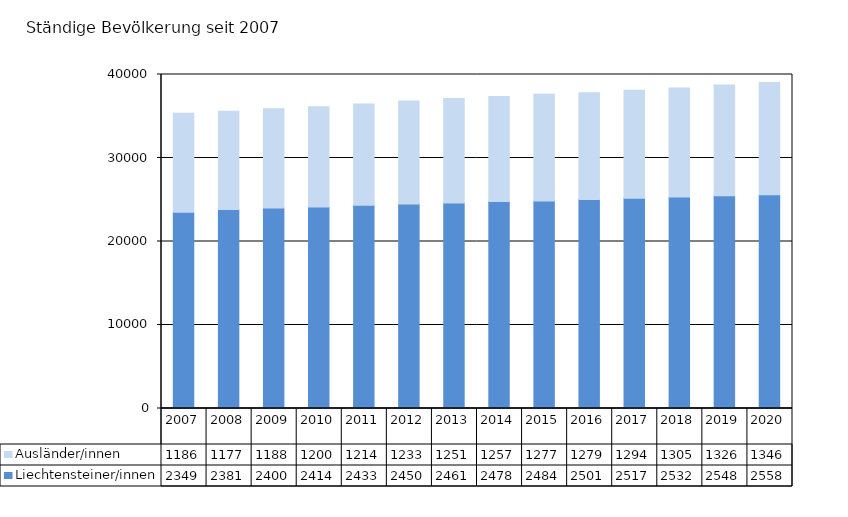
| Category | Liechtensteiner/innen | Ausländer/innen |
|---|---|---|
| 2007.0 | 23494 | 11862 |
| 2008.0 | 23819 | 11770 |
| 2009.0 | 24008 | 11886 |
| 2010.0 | 24145 | 12004 |
| 2011.0 | 24331 | 12144 |
| 2012.0 | 24501 | 12337 |
| 2013.0 | 24610 | 12519 |
| 2014.0 | 24787 | 12579 |
| 2015.0 | 24847 | 12775 |
| 2016.0 | 25015 | 12795 |
| 2017.0 | 25173 | 12941 |
| 2018.0 | 25321 | 13057 |
| 2019.0 | 25485 | 13262 |
| 2020.0 | 25588 | 13467 |